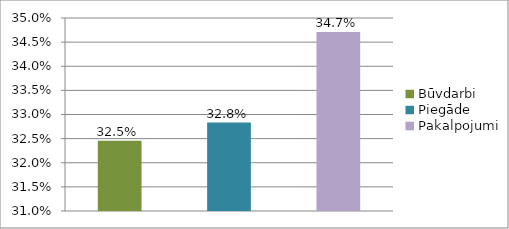
| Category | Series 0 |
|---|---|
| Būvdarbi | 0.325 |
| Piegāde | 0.328 |
| Pakalpojumi | 0.347 |